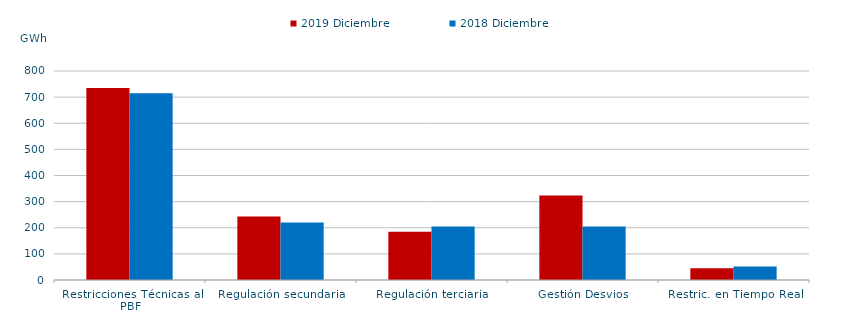
| Category | 2019 Diciembre | 2018 Diciembre |
|---|---|---|
| Restricciones Técnicas al PBF | 735.047 | 714.997 |
| Regulación secundaria | 243.16 | 219.959 |
| Regulación terciaria | 184.743 | 204.405 |
| Gestión Desvios | 323.832 | 205.254 |
| Restric. en Tiempo Real | 45.296 | 51.28 |